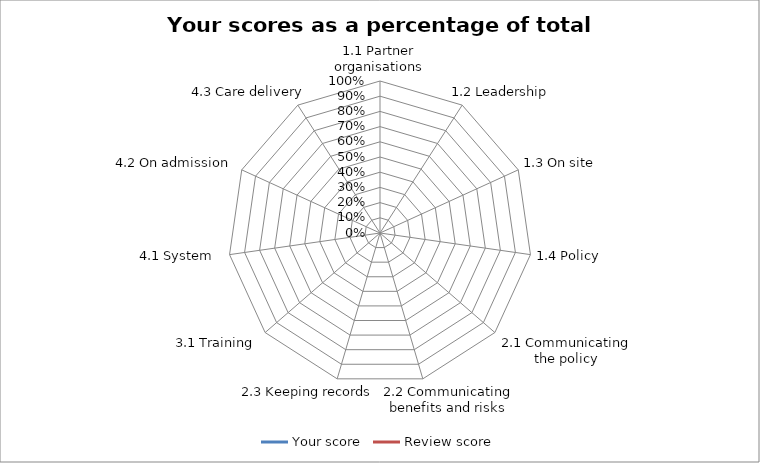
| Category | Your score | Review score |
|---|---|---|
| 1.1 Partner organisations | 0 | 0 |
| 1.2 Leadership | 0 | 0 |
| 1.3 On site | 0 | 0 |
| 1.4 Policy | 0 | 0 |
| 2.1 Communicating the policy | 0 | 0 |
| 2.2 Communicating benefits and risks | 0 | 0 |
| 2.3 Keeping records | 0 | 0 |
| 3.1 Training | 0 | 0 |
| 4.1 System  | 0 | 0 |
| 4.2 On admission | 0 | 0 |
| 4.3 Care delivery | 0 | 0 |